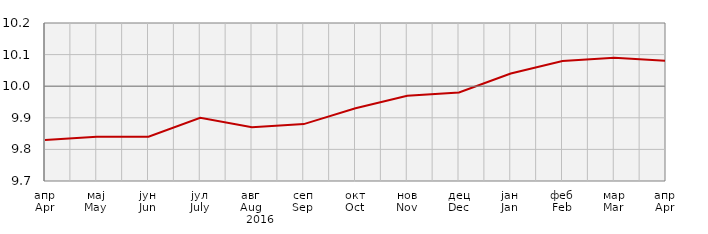
| Category | Series 0 |
|---|---|
| апр
Apr | 98.3 |
| мај
May | 98.4 |
| јун
Jun | 98.4 |
| јул
July | 99 |
| авг
Aug | 98.7 |
| сеп
Sep | 98.8 |
| окт
Oct | 99.3 |
| нов
Nov | 99.7 |
| дец
Dec | 99.8 |
| јан
Jan | 100.4 |
| феб
Feb | 100.8 |
| мар
Mar | 100.9 |
| апр
Apr | 100.8 |